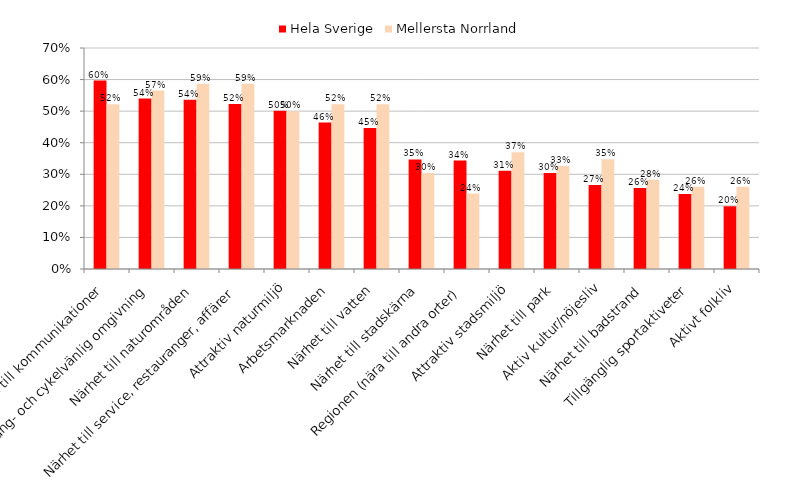
| Category | Hela Sverige | Mellersta Norrland |
|---|---|---|
| Närhet till kommunikationer | 0.597 | 0.522 |
| Gång- och cykelvänlig omgivning | 0.54 | 0.565 |
| Närhet till naturområden | 0.536 | 0.587 |
| Närhet till service, restauranger, affärer | 0.523 | 0.587 |
| Attraktiv naturmiljö | 0.501 | 0.5 |
| Arbetsmarknaden | 0.464 | 0.522 |
| Närhet till vatten | 0.446 | 0.522 |
| Närhet till stadskärna | 0.347 | 0.304 |
| Regionen (nära till andra orter) | 0.343 | 0.239 |
|  Attraktiv stadsmiljö | 0.311 | 0.37 |
| Närhet till park | 0.304 | 0.326 |
| Aktiv kultur/nöjesliv | 0.266 | 0.348 |
| Närhet till badstrand | 0.257 | 0.283 |
| Tillgänglig sportaktiveter | 0.237 | 0.261 |
| Aktivt folkliv | 0.199 | 0.261 |